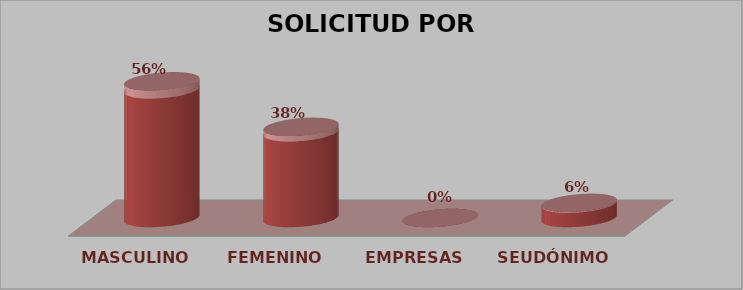
| Category | SOLICITUD POR GÉNERO | Series 1 |
|---|---|---|
| MASCULINO | 9 | 0.562 |
| FEMENINO | 6 | 0.375 |
| EMPRESAS | 0 | 0 |
| SEUDÓNIMO | 1 | 0.062 |